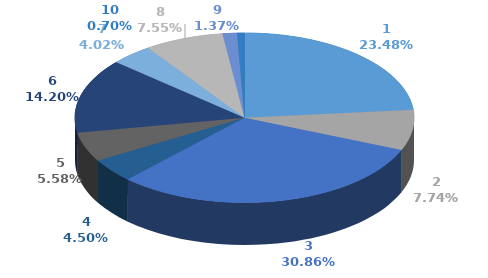
| Category | Series 0 |
|---|---|
| 0 | 333356 |
| 1 | 109840 |
| 2 | 438076 |
| 3 | 63872 |
| 4 | 79212 |
| 5 | 201647 |
| 6 | 57027 |
| 7 | 107143 |
| 8 | 19500 |
| 9 | 10000 |